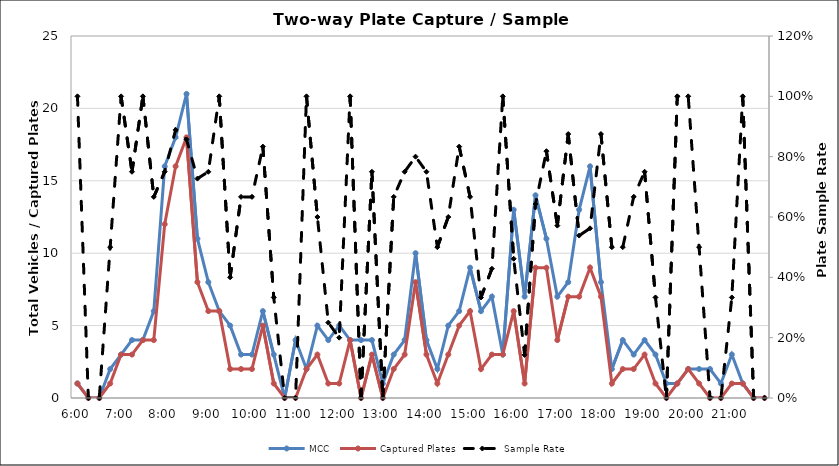
| Category | MCC | Captured Plates |
|---|---|---|
| 0.25 | 1 | 1 |
| 0.260416666666667 | 0 | 0 |
| 0.270833333333333 | 0 | 0 |
| 0.28125 | 2 | 1 |
| 0.291666666666667 | 3 | 3 |
| 0.302083333333333 | 4 | 3 |
| 0.3125 | 4 | 4 |
| 0.322916666666667 | 6 | 4 |
| 0.333333333333333 | 16 | 12 |
| 0.34375 | 18 | 16 |
| 0.354166666666667 | 21 | 18 |
| 0.364583333333333 | 11 | 8 |
| 0.375 | 8 | 6 |
| 0.385416666666667 | 6 | 6 |
| 0.395833333333333 | 5 | 2 |
| 0.40625 | 3 | 2 |
| 0.416666666666667 | 3 | 2 |
| 0.427083333333333 | 6 | 5 |
| 0.4375 | 3 | 1 |
| 0.447916666666667 | 0 | 0 |
| 0.458333333333333 | 4 | 0 |
| 0.46875 | 2 | 2 |
| 0.479166666666667 | 5 | 3 |
| 0.489583333333333 | 4 | 1 |
| 0.5 | 5 | 1 |
| 0.510416666666667 | 4 | 4 |
| 0.520833333333333 | 4 | 0 |
| 0.53125 | 4 | 3 |
| 0.541666666666667 | 1 | 0 |
| 0.552083333333333 | 3 | 2 |
| 0.5625 | 4 | 3 |
| 0.572916666666667 | 10 | 8 |
| 0.583333333333333 | 4 | 3 |
| 0.59375 | 2 | 1 |
| 0.604166666666667 | 5 | 3 |
| 0.614583333333333 | 6 | 5 |
| 0.625 | 9 | 6 |
| 0.635416666666667 | 6 | 2 |
| 0.645833333333333 | 7 | 3 |
| 0.65625 | 3 | 3 |
| 0.666666666666667 | 13 | 6 |
| 0.677083333333333 | 7 | 1 |
| 0.6875 | 14 | 9 |
| 0.697916666666667 | 11 | 9 |
| 0.708333333333333 | 7 | 4 |
| 0.71875 | 8 | 7 |
| 0.729166666666667 | 13 | 7 |
| 0.739583333333333 | 16 | 9 |
| 0.75 | 8 | 7 |
| 0.760416666666667 | 2 | 1 |
| 0.770833333333333 | 4 | 2 |
| 0.78125 | 3 | 2 |
| 0.791666666666667 | 4 | 3 |
| 0.802083333333333 | 3 | 1 |
| 0.8125 | 1 | 0 |
| 0.822916666666667 | 1 | 1 |
| 0.833333333333333 | 2 | 2 |
| 0.84375 | 2 | 1 |
| 0.854166666666667 | 2 | 0 |
| 0.864583333333333 | 1 | 0 |
| 0.875 | 3 | 1 |
| 0.885416666666667 | 1 | 1 |
| 0.895833333333333 | 0 | 0 |
| 0.90625 | 0 | 0 |